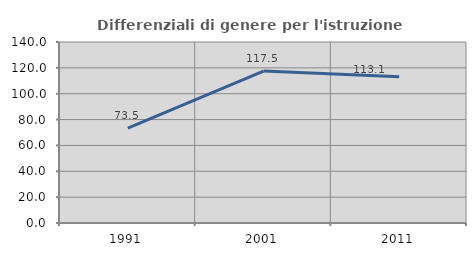
| Category | Differenziali di genere per l'istruzione superiore |
|---|---|
| 1991.0 | 73.46 |
| 2001.0 | 117.5 |
| 2011.0 | 113.145 |